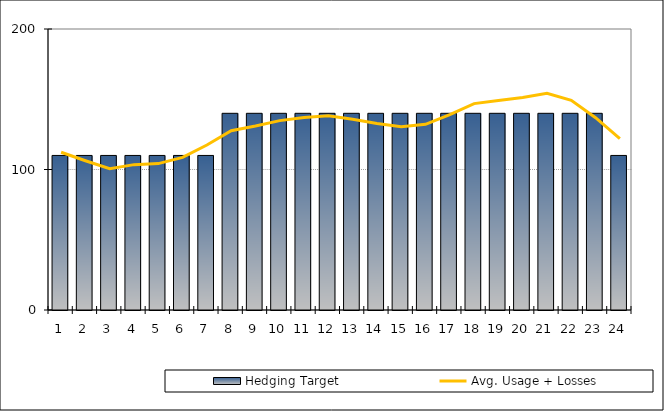
| Category | Hedging Target |
|---|---|
| 1.0 | 110 |
| 2.0 | 110 |
| 3.0 | 110 |
| 4.0 | 110 |
| 5.0 | 110 |
| 6.0 | 110 |
| 7.0 | 110 |
| 8.0 | 140 |
| 9.0 | 140 |
| 10.0 | 140 |
| 11.0 | 140 |
| 12.0 | 140 |
| 13.0 | 140 |
| 14.0 | 140 |
| 15.0 | 140 |
| 16.0 | 140 |
| 17.0 | 140 |
| 18.0 | 140 |
| 19.0 | 140 |
| 20.0 | 140 |
| 21.0 | 140 |
| 22.0 | 140 |
| 23.0 | 140 |
| 24.0 | 110 |